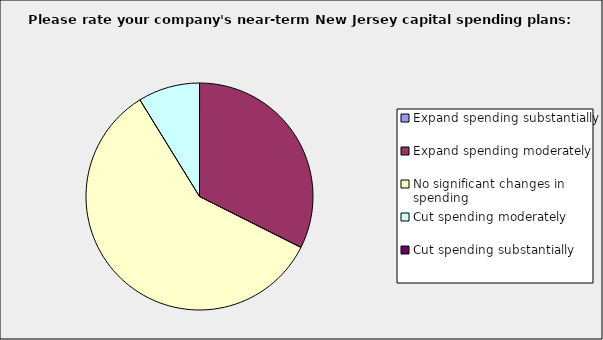
| Category | Series 0 |
|---|---|
| Expand spending substantially | 0 |
| Expand spending moderately | 0.324 |
| No significant changes in spending | 0.588 |
| Cut spending moderately | 0.088 |
| Cut spending substantially | 0 |